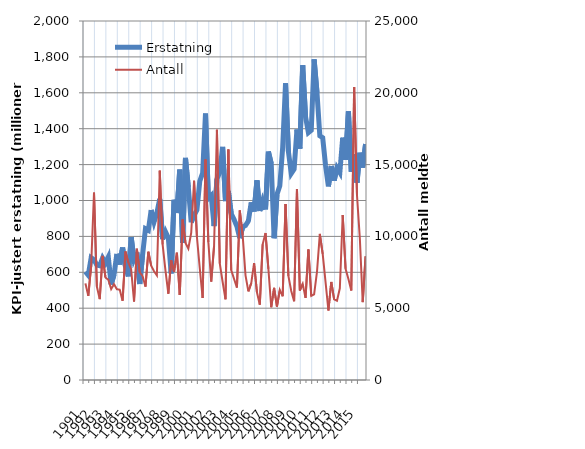
| Category | Erstatning |
|---|---|
| 1991.0 | 603.481 |
| nan | 583.801 |
| nan | 681.18 |
| nan | 669.603 |
| 1992.0 | 640.692 |
| nan | 636.6 |
| nan | 679.715 |
| nan | 652.46 |
| 1993.0 | 685.11 |
| nan | 532.071 |
| nan | 587.038 |
| nan | 702.553 |
| 1994.0 | 643.28 |
| nan | 737.946 |
| nan | 632.475 |
| nan | 577.464 |
| 1995.0 | 795.896 |
| nan | 672.716 |
| nan | 709.814 |
| nan | 535.299 |
| 1996.0 | 697.434 |
| nan | 842.561 |
| nan | 834.158 |
| nan | 946.501 |
| 1997.0 | 880.353 |
| nan | 930.976 |
| nan | 1009.305 |
| nan | 784.671 |
| 1998.0 | 826.639 |
| nan | 792.153 |
| nan | 593.691 |
| nan | 1004.115 |
| 1999.0 | 930.353 |
| nan | 1171.553 |
| nan | 763.248 |
| nan | 1237.391 |
| 2000.0 | 1073.081 |
| nan | 878.192 |
| nan | 918.127 |
| nan | 947.533 |
| 2001.0 | 1107.577 |
| nan | 1152.908 |
| nan | 1484.498 |
| nan | 1011.7 |
| 2002.0 | 1027.564 |
| nan | 857.616 |
| nan | 1119.058 |
| nan | 1157.483 |
| 2003.0 | 1298.758 |
| nan | 996.944 |
| nan | 1052.381 |
| nan | 926.811 |
| 2004.0 | 893.862 |
| nan | 855.082 |
| nan | 790.749 |
| nan | 851.902 |
| 2005.0 | 861.134 |
| nan | 885.928 |
| nan | 989.7 |
| nan | 939.181 |
| 2006.0 | 1112.107 |
| nan | 941.928 |
| nan | 998.915 |
| nan | 950.247 |
| 2007.0 | 1272.529 |
| nan | 1205.484 |
| nan | 789.79 |
| nan | 1033.21 |
| 2008.0 | 1082.173 |
| nan | 1294.715 |
| nan | 1653.143 |
| nan | 1273.488 |
| 2009.0 | 1149.85 |
| nan | 1173.942 |
| nan | 1395.31 |
| nan | 1289.196 |
| 2010.0 | 1753.533 |
| nan | 1467.453 |
| nan | 1377.784 |
| nan | 1391.074 |
| 2011.0 | 1786.114 |
| nan | 1602.462 |
| nan | 1359.902 |
| nan | 1349.973 |
| 2012.0 | 1195.733 |
| nan | 1078.773 |
| nan | 1192.147 |
| nan | 1110.769 |
| 2013.0 | 1181.853 |
| nan | 1155.655 |
| nan | 1350.015 |
| nan | 1227.003 |
| 2014.0 | 1496.943 |
| nan | 1160.463 |
| nan | 1258.954 |
| nan | 1098.824 |
| 2015.0 | 1265.965 |
| nan | 1183.401 |
| nan | 1314.225 |